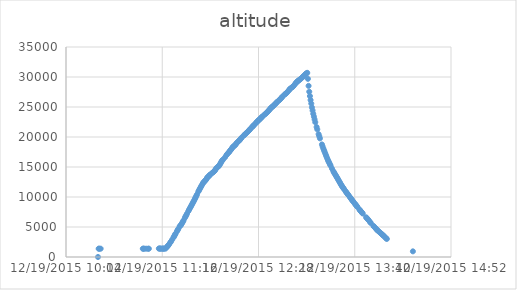
| Category | altitude |
|---|---|
| 42357.43662037037 | 0 |
| 42357.43696759259 | 1385.32 |
| 42357.437314814815 | 1385.32 |
| 42357.43800925926 | 1386.23 |
| 42357.45990740741 | 1381.05 |
| 42357.46025462963 | 1386.23 |
| 42357.46060185185 | 1383.18 |
| 42357.461643518516 | 1386.23 |
| 42357.462685185186 | 1380.13 |
| 42357.46303240741 | 1387.14 |
| 42357.46824074074 | 1408.18 |
| 42357.46858796296 | 1409.09 |
| 42357.468935185185 | 1400.25 |
| 42357.46928240741 | 1394.16 |
| 42357.469976851855 | 1397.2 |
| 42357.47032407407 | 1395.07 |
| 42357.470671296294 | 1395.07 |
| 42357.47101851852 | 1394.16 |
| 42357.471712962964 | 1397.2 |
| 42357.472407407404 | 1658.11 |
| 42357.47275462963 | 1787.35 |
| 42357.47310185185 | 1923.29 |
| 42357.473449074074 | 2069.29 |
| 42357.47414351852 | 2388.41 |
| 42357.474490740744 | 2556.36 |
| 42357.47518518518 | 2904.44 |
| 42357.47587962963 | 3280.56 |
| 42357.47622685185 | 3481.43 |
| 42357.47657407408 | 3688.38 |
| 42357.47692129629 | 3883.46 |
| 42357.47761574074 | 4277.56 |
| 42357.47797453704 | 4474.46 |
| 42357.478310185186 | 4662.53 |
| 42357.47900462963 | 5062.73 |
| 42357.47935185185 | 5227.62 |
| 42357.47969907407 | 5319.67 |
| 42357.480046296296 | 5498.59 |
| 42357.48039351852 | 5692.75 |
| 42357.48075231481 | 5898.79 |
| 42357.481087962966 | 6112.76 |
| 42357.481782407405 | 6542.84 |
| 42357.48212962963 | 6763.82 |
| 42357.48247685185 | 6979.01 |
| 42357.482824074075 | 7196.94 |
| 42357.48351851852 | 7624.88 |
| 42357.48386574074 | 7836.1 |
| 42357.48422453704 | 8040.01 |
| 42357.484560185185 | 8243.93 |
| 42357.48490740741 | 8439.91 |
| 42357.48525462963 | 8645.96 |
| 42357.485601851855 | 8851.09 |
| 42357.48594907407 | 9063.23 |
| 42357.486296296294 | 9270.19 |
| 42357.48664351852 | 9486.29 |
| 42357.48699074074 | 9706.36 |
| 42357.487337962964 | 9940.14 |
| 42357.48768518519 | 10178.19 |
| 42357.488032407404 | 10408.31 |
| 42357.48872685185 | 10885.32 |
| 42357.48908564815 | 11094.42 |
| 42357.4894212963 | 11307.47 |
| 42357.48976851852 | 11509.55 |
| 42357.490115740744 | 11707.37 |
| 42357.49046296296 | 11913.41 |
| 42357.49081018518 | 12107.57 |
| 42357.49115740741 | 12319.41 |
| 42357.49150462963 | 12453.52 |
| 42357.49185185185 | 12566.6 |
| 42357.49219907408 | 12688.52 |
| 42357.49254629629 | 12812.57 |
| 42357.492893518516 | 12948.51 |
| 42357.49324074074 | 13177.72 |
| 42357.49358796296 | 13307.57 |
| 42357.493935185186 | 13395.66 |
| 42357.49428240741 | 13495.63 |
| 42357.49462962963 | 13653.82 |
| 42357.49497685185 | 13747.7 |
| 42357.495671296296 | 13926.62 |
| 42357.49636574074 | 14109.8 |
| 42357.496712962966 | 14203.68 |
| 42357.49706018518 | 14310.66 |
| 42357.497407407405 | 14430.76 |
| 42357.49775462963 | 14629.79 |
| 42357.49810185185 | 14818.77 |
| 42357.4987962963 | 14995.86 |
| 42357.49914351852 | 15095.83 |
| 42357.49949074074 | 15202.81 |
| 42357.49983796296 | 15355.82 |
| 42357.500185185185 | 15556.08 |
| 42357.50053240741 | 15770.96 |
| 42357.50087962963 | 15970.91 |
| 42357.501226851855 | 16112.95 |
| 42357.50157407407 | 16237.92 |
| 42357.50261574074 | 16616.17 |
| 42357.50331018519 | 16954.2 |
| 42357.503657407404 | 17113 |
| 42357.50435185185 | 17352.26 |
| 42357.504699074074 | 17477.23 |
| 42357.5050462963 | 17643.35 |
| 42357.50539351852 | 17777.16 |
| 42357.505740740744 | 17897.25 |
| 42357.50608796296 | 18065.19 |
| 42357.50643518518 | 18247.16 |
| 42357.50678240741 | 18347.44 |
| 42357.50712962963 | 18454.42 |
| 42357.50747685185 | 18554.4 |
| 42357.50782407408 | 18651.32 |
| 42357.50817129629 | 18771.41 |
| 42357.508518518516 | 18932.35 |
| 42357.50886574074 | 19085.36 |
| 42357.509560185186 | 19278.3 |
| 42357.50990740741 | 19380.4 |
| 42357.51025462963 | 19483.43 |
| 42357.51060185185 | 19639.48 |
| 42357.51094907407 | 19787.62 |
| 42357.511296296296 | 19907.4 |
| 42357.512337962966 | 20241.46 |
| 42357.51268518518 | 20347.53 |
| 42357.513032407405 | 20454.52 |
| 42357.51337962963 | 20563.64 |
| 42357.51372685185 | 20669.71 |
| 42357.514074074075 | 20772.73 |
| 42357.5144212963 | 20881.54 |
| 42357.51476851852 | 20997.67 |
| 42357.51511574074 | 21118.68 |
| 42357.51546296296 | 21240.6 |
| 42357.515810185185 | 21363.74 |
| 42357.51650462963 | 21611.84 |
| 42357.516851851855 | 21720.66 |
| 42357.51719907407 | 21836.79 |
| 42357.517546296294 | 21959.62 |
| 42357.51789351852 | 22067.82 |
| 42357.518587962964 | 22309.84 |
| 42357.51893518519 | 22428.71 |
| 42357.519282407404 | 22543.92 |
| 42357.51962962963 | 22660.97 |
| 42357.51997685185 | 22769.78 |
| 42357.520324074074 | 22867.92 |
| 42357.5206712963 | 22968.81 |
| 42357.52101851852 | 23085.86 |
| 42357.521365740744 | 23201.99 |
| 42357.52171296296 | 23312.93 |
| 42357.52206018518 | 23419.92 |
| 42357.52275462963 | 23618.04 |
| 42357.52344907408 | 23818.9 |
| 42357.52379629629 | 23914 |
| 42357.524143518516 | 24016.11 |
| 42357.52449074074 | 24124.01 |
| 42357.52483796296 | 24241.96 |
| 42357.525185185186 | 24366.02 |
| 42357.52553240741 | 24494.95 |
| 42357.52587962963 | 24629.06 |
| 42357.52622685185 | 24760.12 |
| 42357.52657407407 | 24878.08 |
| 42357.526921296296 | 24973.18 |
| 42357.52726851852 | 25063.09 |
| 42357.52761574074 | 25162.15 |
| 42357.527962962966 | 25268.22 |
| 42357.52831018518 | 25387.1 |
| 42357.528657407405 | 25494.08 |
| 42357.52900462963 | 25603.2 |
| 42357.52935185185 | 25728.17 |
| 42357.529699074075 | 25852.22 |
| 42357.53039351852 | 26041.2 |
| 42357.53074074074 | 26133.25 |
| 42357.53108796296 | 26232.31 |
| 42357.531435185185 | 26354.23 |
| 42357.53178240741 | 26479.2 |
| 42357.53212962963 | 26610.26 |
| 42357.532476851855 | 26740.41 |
| 42357.53351851852 | 27062.28 |
| 42357.53386574074 | 27150.36 |
| 42357.534212962964 | 27244.55 |
| 42357.53456018519 | 27342.39 |
| 42357.534907407404 | 27445.41 |
| 42357.53560185185 | 27710.59 |
| 42357.535949074074 | 27854.45 |
| 42357.5362962963 | 27994.36 |
| 42357.53664351852 | 28107.44 |
| 42357.53733796296 | 28250.39 |
| 42357.53768518518 | 28338.48 |
| 42357.53803240741 | 28444.55 |
| 42357.53837962963 | 28575.61 |
| 42357.53907407408 | 28853.59 |
| 42357.53942129629 | 28996.54 |
| 42357.539768518516 | 29126.69 |
| 42357.54011574074 | 29250.74 |
| 42357.54046296296 | 29303.78 |
| 42357.540810185186 | 29428.74 |
| 42357.54115740741 | 29508.6 |
| 42357.54150462963 | 29589.68 |
| 42357.54185185185 | 29675.63 |
| 42357.54219907407 | 29767.68 |
| 42357.542546296296 | 29870.7 |
| 42357.54289351852 | 29976.78 |
| 42357.54324074074 | 30092.9 |
| 42357.543587962966 | 30217.87 |
| 42357.544282407405 | 30439.77 |
| 42357.54462962963 | 30532.73 |
| 42357.54497685185 | 30618.68 |
| 42357.545324074075 | 30696.71 |
| 42357.5456712963 | 29692.7 |
| 42357.54601851852 | 28521.66 |
| 42357.54636574074 | 27545.39 |
| 42357.54671296296 | 26826.36 |
| 42357.547060185185 | 26158.24 |
| 42357.547418981485 | 25577.29 |
| 42357.54775462963 | 24934.16 |
| 42357.548101851855 | 24414.18 |
| 42357.54844907407 | 23853.95 |
| 42357.548796296294 | 23388.83 |
| 42357.54914351852 | 22917.91 |
| 42357.54949074074 | 22459.8 |
| 42357.55018518519 | 21667.62 |
| 42357.550532407404 | 21269.55 |
| 42357.55122685185 | 20472.5 |
| 42357.551574074074 | 20127.47 |
| 42357.5519212963 | 19771.46 |
| 42357.55296296296 | 18759.22 |
| 42357.55331018518 | 18409.31 |
| 42357.55365740741 | 18092.32 |
| 42357.55400462963 | 17808.24 |
| 42357.55435185185 | 17533.32 |
| 42357.55469907408 | 17234.31 |
| 42357.55504629629 | 16956.02 |
| 42357.555393518516 | 16682.01 |
| 42357.55574074074 | 16392.14 |
| 42357.55608796296 | 16134.89 |
| 42357.556435185186 | 15892.88 |
| 42357.55678240741 | 15661.84 |
| 42357.55712962963 | 15439.03 |
| 42357.55747685185 | 15208.91 |
| 42357.558171296296 | 14730.98 |
| 42357.55886574074 | 14306.7 |
| 42357.559212962966 | 14101.88 |
| 42357.55956018518 | 13903.76 |
| 42357.559907407405 | 13715.7 |
| 42357.56025462963 | 13530.68 |
| 42357.56060185185 | 13344.75 |
| 42357.560949074075 | 13158.52 |
| 42357.5612962963 | 12969.54 |
| 42357.56164351852 | 12767.46 |
| 42357.56199074074 | 12573.61 |
| 42357.56233796296 | 12375.49 |
| 42357.562685185185 | 12171.58 |
| 42357.563055555554 | 11981.38 |
| 42357.56337962963 | 11807.34 |
| 42357.563726851855 | 11644.58 |
| 42357.56407407407 | 11482.43 |
| 42357.564421296294 | 11321.49 |
| 42357.56511574074 | 11006.33 |
| 42357.565462962964 | 10850.27 |
| 42357.56581018519 | 10697.26 |
| 42357.566157407404 | 10549.43 |
| 42357.56650462963 | 10400.39 |
| 42357.56686342593 | 10256.22 |
| 42357.567557870374 | 9958.12 |
| 42357.56789351852 | 9806.33 |
| 42357.56825231481 | 9650.27 |
| 42357.56858796296 | 9497.26 |
| 42357.56893518518 | 9350.04 |
| 42357.56928240741 | 9205.26 |
| 42357.56997685185 | 8922.11 |
| 42357.57032407408 | 8780.07 |
| 42357.57067129629 | 8637.12 |
| 42357.57103009259 | 8492.95 |
| 42357.57136574074 | 8345.12 |
| 42357.57241898148 | 7922.97 |
| 42357.5727662037 | 7783.98 |
| 42357.573113425926 | 7641.95 |
| 42357.57346064815 | 7509.05 |
| 42357.57380787037 | 7377.99 |
| 42357.574155092596 | 7249.06 |
| 42357.575902777775 | 6615.68 |
| 42357.57625 | 6489.8 |
| 42357.57659722222 | 6361.79 |
| 42357.576944444445 | 6230.72 |
| 42357.57729166667 | 6093.87 |
| 42357.57798611111 | 5808.88 |
| 42357.57833333333 | 5669.58 |
| 42357.579722222225 | 5171.54 |
| 42357.58005787037 | 5069.74 |
| 42357.58075231482 | 4821.63 |
| 42357.58111111111 | 4688.74 |
| 42357.58144675926 | 4561.64 |
| 42357.58180555556 | 4447.64 |
| 42357.58215277778 | 4344.62 |
| 42357.5828587963 | 4150.46 |
| 42357.58319444444 | 4051.4 |
| 42357.58353009259 | 3955.39 |
| 42357.58388888889 | 3860.6 |
| 42357.58423611111 | 3761.54 |
| 42357.58458333334 | 3657.6 |
| 42357.58491898148 | 3556.41 |
| 42357.585277777776 | 3447.29 |
| 42357.58597222222 | 3230.27 |
| 42357.58631944445 | 3118.41 |
| 42357.58666666667 | 3010.51 |
| 42357.60020833334 | 943.05 |